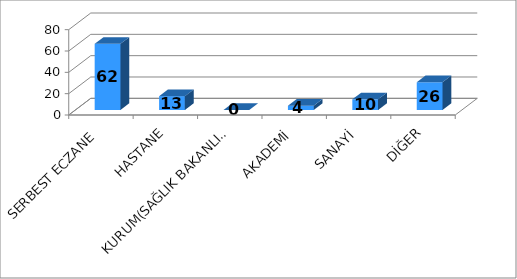
| Category | Series 0 |
|---|---|
| SERBEST ECZANE | 62 |
| HASTANE | 13 |
| KURUM(SAĞLIK BAKANLIĞI, SGK vb.) | 0 |
| AKADEMİ | 4 |
| SANAYİ | 10 |
| DİĞER | 26 |